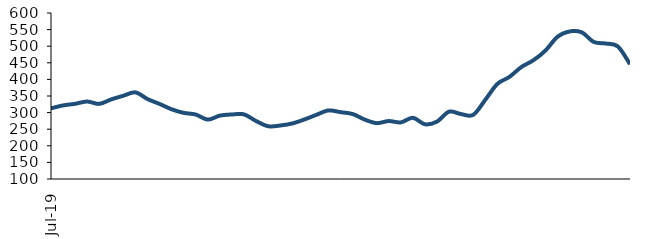
| Category | Series 0 |
|---|---|
| 2019-07-01 | 312.749 |
| 2019-08-01 | 321.636 |
| 2019-09-01 | 326.515 |
| 2019-10-01 | 333.383 |
| 2019-11-01 | 326.295 |
| 2019-12-01 | 339.824 |
| 2020-01-01 | 350.768 |
| 2020-02-01 | 360.883 |
| 2020-03-01 | 340.754 |
| 2020-04-01 | 326.108 |
| 2020-05-01 | 309.949 |
| 2020-06-01 | 299.181 |
| 2020-07-01 | 294.112 |
| 2020-08-01 | 278.992 |
| 2020-09-01 | 290.987 |
| 2020-10-01 | 294.359 |
| 2020-11-01 | 294.596 |
| 2020-12-01 | 274.651 |
| 2021-01-01 | 258.932 |
| 2021-02-01 | 261.112 |
| 2021-03-01 | 267.235 |
| 2021-04-01 | 279.241 |
| 2021-05-01 | 293.25 |
| 2021-06-01 | 306.524 |
| 2021-07-01 | 301.301 |
| 2021-08-01 | 295.799 |
| 2021-09-01 | 279.082 |
| 2021-10-01 | 268.296 |
| 2021-11-01 | 274.558 |
| 2021-12-01 | 270.511 |
| 2022-01-01 | 284.312 |
| 2022-02-01 | 264.809 |
| 2022-03-01 | 272.939 |
| 2022-04-01 | 302.833 |
| 2022-05-01 | 295.467 |
| 2022-06-01 | 293.185 |
| 2022-07-01 | 338.335 |
| 2022-08-01 | 386.233 |
| 2022-09-01 | 407.447 |
| 2022-10-01 | 437.443 |
| 2022-11-01 | 457.804 |
| 2022-12-01 | 487.211 |
| 2023-01-01 | 528.719 |
| 2023-02-01 | 544.441 |
| 2023-03-01 | 541.779 |
| 2023-04-01 | 512.769 |
| 2023-05-01 | 508.079 |
| 2023-06-01 | 498.924 |
| 2023-07-01 | 445.734 |